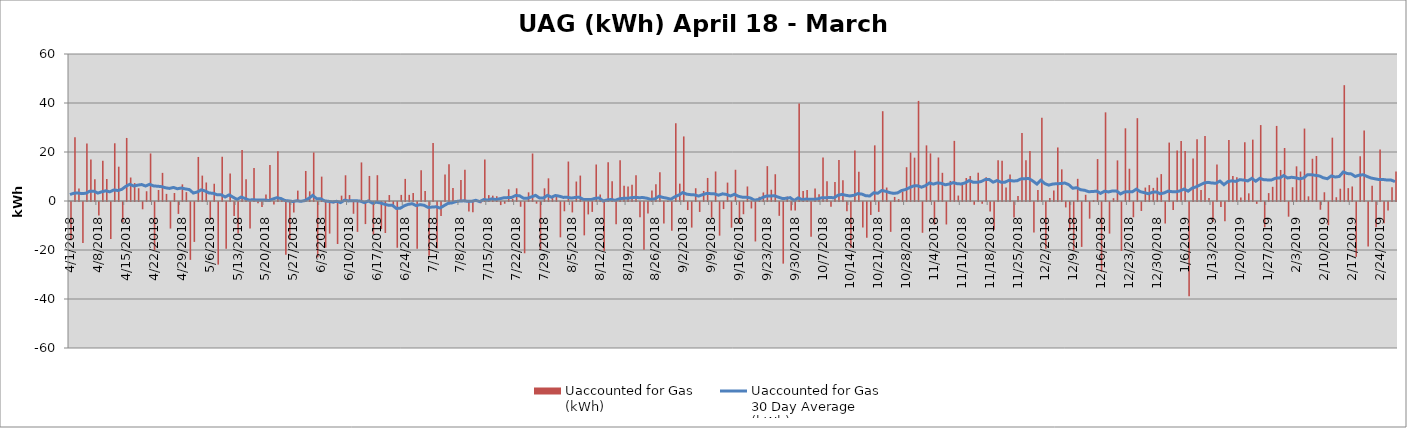
| Category | Uaccounted for Gas 
(kWh) |
|---|---|
| 4/1/18 | -15658125 |
| 4/2/18 | 26015403 |
| 4/3/18 | 5051025 |
| 4/4/18 | -16688992 |
| 4/5/18 | 23421405 |
| 4/6/18 | 16971481 |
| 4/7/18 | 8877600 |
| 4/8/18 | -5487145 |
| 4/9/18 | 16451917 |
| 4/10/18 | 9025739 |
| 4/11/18 | -15117433 |
| 4/12/18 | 23564728 |
| 4/13/18 | 14007820 |
| 4/14/18 | -8170911 |
| 4/15/18 | 25738298 |
| 4/16/18 | 9588799 |
| 4/17/18 | 7309420 |
| 4/18/18 | 5202558 |
| 4/19/18 | -2981597 |
| 4/20/18 | 3982564 |
| 4/21/18 | 19405629 |
| 4/22/18 | -19671075 |
| 4/23/18 | 4497848 |
| 4/24/18 | 11481412 |
| 4/25/18 | 2910766 |
| 4/26/18 | -10844341 |
| 4/27/18 | 3254680 |
| 4/28/18 | -4864854 |
| 4/29/18 | 6794079 |
| 4/30/18 | 3621745 |
| 5/1/18 | -23614366 |
| 5/2/18 | -16292802 |
| 5/3/18 | 17981897 |
| 5/4/18 | 10364219 |
| 5/5/18 | 7554162 |
| 5/6/18 | -7345702 |
| 5/7/18 | 7043708 |
| 5/8/18 | -25547286 |
| 5/9/18 | 18094809 |
| 5/10/18 | -19127397 |
| 5/11/18 | 11223263 |
| 5/12/18 | -5746042 |
| 5/13/18 | -12827655 |
| 5/14/18 | 20774823 |
| 5/15/18 | 8899787 |
| 5/16/18 | -10860723 |
| 5/17/18 | 13518896 |
| 5/18/18 | -554376 |
| 5/19/18 | -2024676 |
| 5/20/18 | 2637353 |
| 5/21/18 | 14671991 |
| 5/22/18 | -1039536 |
| 5/23/18 | 20274431 |
| 5/24/18 | 1151581 |
| 5/25/18 | -21483294 |
| 5/26/18 | -15387521 |
| 5/27/18 | -4319399 |
| 5/28/18 | 4237444 |
| 5/29/18 | 282864 |
| 5/30/18 | 12257861 |
| 5/31/18 | 3962321 |
| 6/1/18 | 19802011 |
| 6/2/18 | -22597953 |
| 6/3/18 | 9947618 |
| 6/4/18 | -18647518 |
| 6/5/18 | -12895102 |
| 6/6/18 | -623278 |
| 6/7/18 | -17148640 |
| 6/8/18 | 2190769 |
| 6/9/18 | 10497982 |
| 6/10/18 | 2428479 |
| 6/11/18 | -4803975 |
| 6/12/18 | -12196700 |
| 6/13/18 | 15744325 |
| 6/14/18 | -9015839 |
| 6/15/18 | 10230907 |
| 6/16/18 | -13299647 |
| 6/17/18 | 10529943 |
| 6/18/18 | -11041294 |
| 6/19/18 | -12643875 |
| 6/20/18 | 2429972 |
| 6/21/18 | -1521838 |
| 6/22/18 | -18676547 |
| 6/23/18 | 2492544 |
| 6/24/18 | 9024949 |
| 6/25/18 | 2510797 |
| 6/26/18 | 3270316 |
| 6/27/18 | -19079133 |
| 6/28/18 | 12596768 |
| 6/29/18 | 4088036 |
| 6/30/18 | -21909346 |
| 7/1/18 | 23651297 |
| 7/2/18 | -18897699 |
| 7/3/18 | -5684340 |
| 7/4/18 | 10793161 |
| 7/5/18 | 14992216 |
| 7/6/18 | 5328674 |
| 7/7/18 | -387772 |
| 7/8/18 | 8571809 |
| 7/9/18 | 12737039 |
| 7/10/18 | -3907844 |
| 7/11/18 | -4193629 |
| 7/12/18 | 11977 |
| 7/13/18 | -509667 |
| 7/14/18 | 16938400 |
| 7/15/18 | 2407925 |
| 7/16/18 | 2176303 |
| 7/17/18 | 1947809 |
| 7/18/18 | -1269270 |
| 7/19/18 | -700348 |
| 7/20/18 | 4784543 |
| 7/21/18 | 909714 |
| 7/22/18 | 5181337 |
| 7/23/18 | -1938823 |
| 7/24/18 | -20930235 |
| 7/25/18 | 3537084 |
| 7/26/18 | 19387113 |
| 7/27/18 | -683119 |
| 7/28/18 | -19699830 |
| 7/29/18 | 5178632 |
| 7/30/18 | 9253570 |
| 7/31/18 | 1204190 |
| 8/1/18 | 2071529 |
| 8/2/18 | -14424980 |
| 8/3/18 | -3788383 |
| 8/4/18 | 16110116 |
| 8/5/18 | -4254295 |
| 8/6/18 | 7950015 |
| 8/7/18 | 10377892 |
| 8/8/18 | -13617791 |
| 8/9/18 | -5070129 |
| 8/10/18 | -4041653 |
| 8/11/18 | 14898316 |
| 8/12/18 | 2684458 |
| 8/13/18 | -20071923 |
| 8/14/18 | 15791240 |
| 8/15/18 | 8093404 |
| 8/16/18 | -9086258 |
| 8/17/18 | 16667947 |
| 8/18/18 | 6201336 |
| 8/19/18 | 5900633 |
| 8/20/18 | 6647370 |
| 8/21/18 | 10556113 |
| 8/22/18 | -6217733 |
| 8/23/18 | -19486109 |
| 8/24/18 | -4672964 |
| 8/25/18 | 4304958 |
| 8/26/18 | 6882725 |
| 8/27/18 | 11694792 |
| 8/28/18 | -8745572 |
| 8/29/18 | 97484 |
| 8/30/18 | -11741351 |
| 8/31/18 | 31707278 |
| 9/1/18 | 7081505 |
| 9/2/18 | 26357046 |
| 9/3/18 | -3280487 |
| 9/4/18 | -10444309 |
| 9/5/18 | 5214065 |
| 9/6/18 | -4058832 |
| 9/7/18 | 4100091 |
| 9/8/18 | 9411837 |
| 9/9/18 | -6398435 |
| 9/10/18 | 12055888 |
| 9/11/18 | -13735059 |
| 9/12/18 | -2892620 |
| 9/13/18 | 7510791 |
| 9/14/18 | -10501346 |
| 9/15/18 | 12753518 |
| 9/16/18 | -8679732 |
| 9/17/18 | -4985240 |
| 9/18/18 | 5930516 |
| 9/19/18 | -2649942 |
| 9/20/18 | -16110488 |
| 9/21/18 | 1718111 |
| 9/22/18 | 3481917 |
| 9/23/18 | 14229011 |
| 9/24/18 | 4596930 |
| 9/25/18 | 10926057 |
| 9/26/18 | -5646864 |
| 9/27/18 | -25159984 |
| 9/28/18 | 1822076 |
| 9/29/18 | -3458565 |
| 9/30/18 | -3434220 |
| 10/1/18 | 39782640 |
| 10/2/18 | 4072595 |
| 10/3/18 | 4506771 |
| 10/4/18 | -14157373 |
| 10/5/18 | 5115037 |
| 10/6/18 | 2725924 |
| 10/7/18 | 17764863 |
| 10/8/18 | 8033320 |
| 10/9/18 | -1950123 |
| 10/10/18 | 7714816 |
| 10/11/18 | 16729824 |
| 10/12/18 | 8466193 |
| 10/13/18 | -3805235 |
| 10/14/18 | -18662057 |
| 10/15/18 | 20659393 |
| 10/16/18 | 11973842 |
| 10/17/18 | -10361714 |
| 10/18/18 | -14598962 |
| 10/19/18 | -5282757 |
| 10/20/18 | 22715968 |
| 10/21/18 | -4040582 |
| 10/22/18 | 36652189 |
| 10/23/18 | 5497041 |
| 10/24/18 | -12191072 |
| 10/25/18 | 1659320 |
| 10/26/18 | 762856 |
| 10/27/18 | 3825791 |
| 10/28/18 | 13788744 |
| 10/29/18 | 19779590 |
| 10/30/18 | 17692175 |
| 10/31/18 | 40858013 |
| 11/1/18 | -12567744 |
| 11/2/18 | 22705528 |
| 11/3/18 | 19429131 |
| 11/4/18 | -9219883 |
| 11/5/18 | 17769728 |
| 11/6/18 | 11506003 |
| 11/7/18 | -9173772 |
| 11/8/18 | 8202522 |
| 11/9/18 | 24542920 |
| 11/10/18 | 2219983 |
| 11/11/18 | 6627537 |
| 11/12/18 | 9383116 |
| 11/13/18 | 10204886 |
| 11/14/18 | -1135092 |
| 11/15/18 | 11551553 |
| 11/16/18 | -736475 |
| 11/17/18 | 9666641 |
| 11/18/18 | -3854028 |
| 11/19/18 | -11295331 |
| 11/20/18 | 16635588 |
| 11/21/18 | 16456205 |
| 11/22/18 | 5529830 |
| 11/23/18 | 10805899 |
| 11/24/18 | -6319432 |
| 11/25/18 | 2062069 |
| 11/26/18 | 27736187 |
| 11/27/18 | 16653958 |
| 11/28/18 | 20361369 |
| 11/29/18 | -12427330 |
| 11/30/18 | 4473214 |
| 12/1/18 | 33963447 |
| 12/2/18 | -19131630 |
| 12/3/18 | 1242293 |
| 12/4/18 | 4245440 |
| 12/5/18 | 21855347 |
| 12/6/18 | 12918929 |
| 12/7/18 | -2206410 |
| 12/8/18 | -11653790 |
| 12/9/18 | -19786900 |
| 12/10/18 | 9054960 |
| 12/11/18 | -18327818 |
| 12/12/18 | 2547081 |
| 12/13/18 | -6809887 |
| 12/14/18 | 323195 |
| 12/15/18 | 17115328 |
| 12/16/18 | -28483085 |
| 12/17/18 | 36186688 |
| 12/18/18 | -12896189 |
| 12/19/18 | 1157179 |
| 12/20/18 | 16572421 |
| 12/21/18 | -20007798 |
| 12/22/18 | 29670256 |
| 12/23/18 | 13170489 |
| 12/24/18 | -6229326 |
| 12/25/18 | 33810918 |
| 12/26/18 | -3657500 |
| 12/27/18 | 5489427 |
| 12/28/18 | 6486861 |
| 12/29/18 | 5343546 |
| 12/30/18 | 9546206 |
| 12/31/18 | 10980907 |
| 1/1/19 | -8782391.722 |
| 1/2/19 | 23844551 |
| 1/3/19 | -3301738 |
| 1/4/19 | 20587904.556 |
| 1/5/19 | 24508092.222 |
| 1/6/19 | 20375283.722 |
| 1/7/19 | -38445548.253 |
| 1/8/19 | 17369771 |
| 1/9/19 | 25202096 |
| 1/10/19 | 4537340 |
| 1/11/19 | 26560636 |
| 1/12/19 | 1179393 |
| 1/13/19 | -8140925 |
| 1/14/19 | 14940459 |
| 1/15/19 | -2060352 |
| 1/16/19 | -7866938 |
| 1/17/19 | 24940262.167 |
| 1/18/19 | 10187997 |
| 1/19/19 | 9703248 |
| 1/20/19 | 1452957 |
| 1/21/19 | 23979707 |
| 1/22/19 | 3131209 |
| 1/23/19 | 25053178 |
| 1/24/19 | -763744 |
| 1/25/19 | 30991832 |
| 1/26/19 | -10341106 |
| 1/27/19 | 3229379 |
| 1/28/19 | 5784062 |
| 1/29/19 | 30645320 |
| 1/30/19 | 12680002 |
| 1/31/19 | 21622661 |
| 2/1/19 | -5991047 |
| 2/2/19 | 5622220.389 |
| 2/3/19 | 14153259.056 |
| 2/4/19 | 12035337.944 |
| 2/5/19 | 29567775.056 |
| 2/6/19 | 1906054.944 |
| 2/7/19 | 17244736.389 |
| 2/8/19 | 18368713.222 |
| 2/9/19 | -3159377.222 |
| 2/10/19 | 3567798.889 |
| 2/11/19 | -9463797.459 |
| 2/12/19 | 25850386.721 |
| 2/13/19 | 1539653.667 |
| 2/14/19 | 5025336.581 |
| 2/15/19 | 47278176 |
| 2/16/19 | 5252964 |
| 2/17/19 | 5931144 |
| 2/18/19 | -22390369.167 |
| 2/19/19 | 18290669 |
| 2/20/19 | 28754490.417 |
| 2/21/19 | -18193441.778 |
| 2/22/19 | 6207068.08 |
| 2/23/19 | -10305127.056 |
| 2/24/19 | 21044413 |
| 2/25/19 | -8688779.611 |
| 2/26/19 | -3426774.596 |
| 2/27/19 | 5583113.965 |
| 2/28/19 | 11999089 |